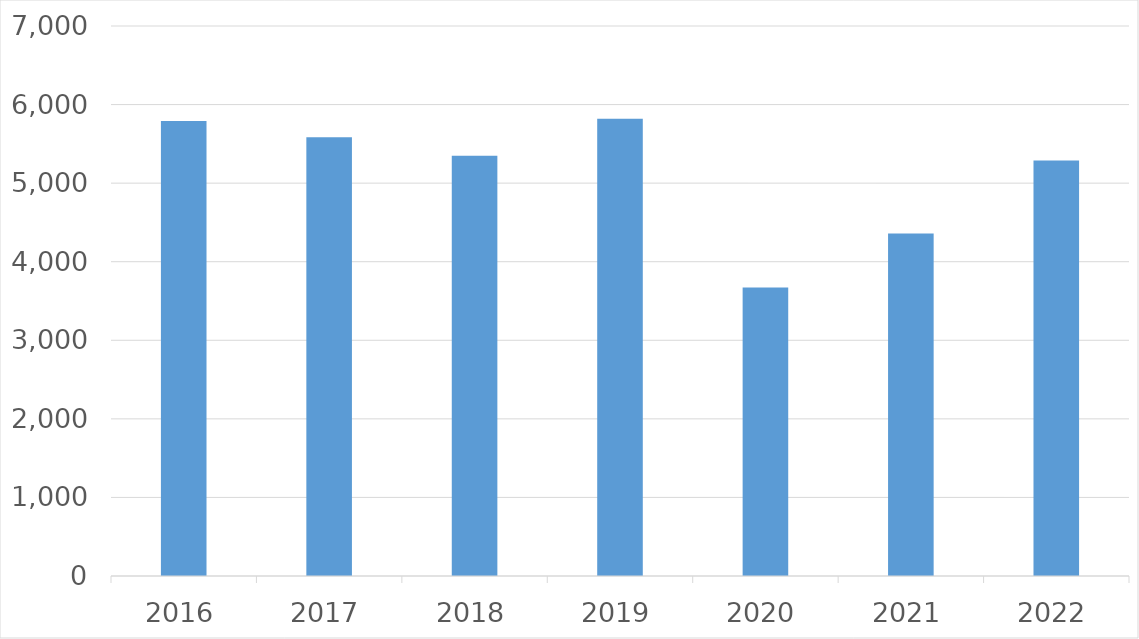
| Category | Series 0 |
|---|---|
| 2016 | 5792 |
| 2017 | 5584 |
| 2018 | 5349 |
| 2019 | 5819 |
| 2020 | 3671 |
| 2021 | 4358 |
| 2022 | 5287 |